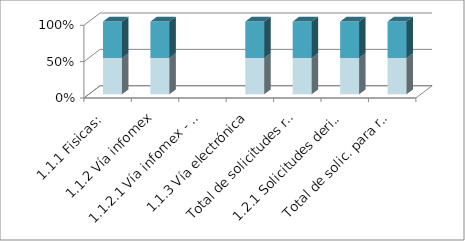
| Category | Series 3 | Series 4 | Series 5 | Series 0 | Series 1 | Series 2 |
|---|---|---|---|---|---|---|
| 1.1.1 Fisicas: |  |  | 2 |  |  | 2 |
| 1.1.2 Vía infomex |  |  | 5 |  |  | 5 |
| 1.1.2.1 Vía infomex - PNT |  |  | 0 |  |  | 0 |
| 1.1.3 Vía electrónica |  |  | 33 |  |  | 33 |
| Total de solicitudes recibidas: |  |  | 40 |  |  | 40 |
| 1.2.1 Solicitudes derivadas por incom |  |  | 3 |  |  | 3 |
| Total de solic. para resolución: |  |  | 37 |  |  | 37 |